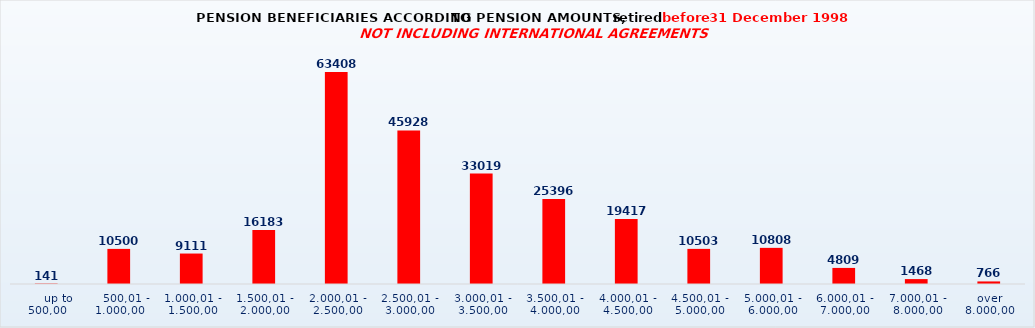
| Category | Series 0 |
|---|---|
|      up to 500,00 | 141 |
|    500,01 - 1.000,00 | 10500 |
| 1.000,01 - 1.500,00 | 9111 |
| 1.500,01 - 2.000,00 | 16183 |
| 2.000,01 - 2.500,00 | 63408 |
| 2.500,01 - 3.000,00 | 45928 |
| 3.000,01 - 3.500,00 | 33019 |
| 3.500,01 - 4.000,00 | 25396 |
| 4.000,01 - 4.500,00 | 19417 |
| 4.500,01 - 5.000,00 | 10503 |
| 5.000,01 - 6.000,00 | 10808 |
| 6.000,01 - 7.000,00 | 4809 |
| 7.000,01 - 8.000,00 | 1468 |
| over 8.000,00 | 766 |